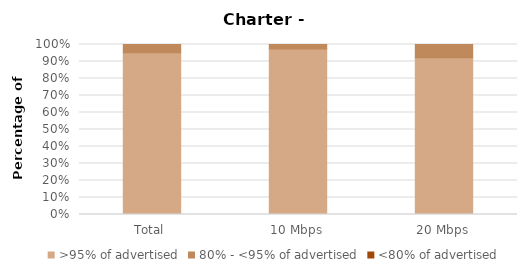
| Category | >95% of advertised | 80% - <95% of advertised | <80% of advertised |
|---|---|---|---|
| Total | 0.951 | 0.049 | 0 |
| 10 Mbps | 0.974 | 0.026 | 0 |
| 20 Mbps | 0.921 | 0.079 | 0 |